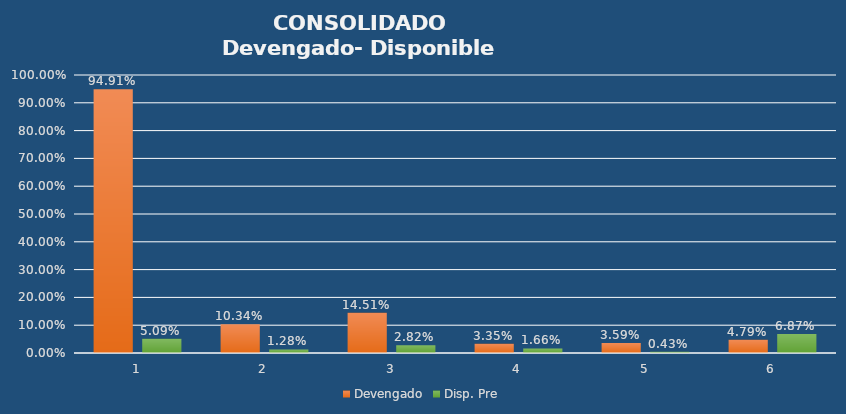
| Category | Devengado | Disp. Pre |
|---|---|---|
| 0 | 0.949 | 0.051 |
| 1 | 0.103 | 0.013 |
| 2 | 0.145 | 0.028 |
| 3 | 0.033 | 0.017 |
| 4 | 0.036 | 0.004 |
| 5 | 0.048 | 0.069 |